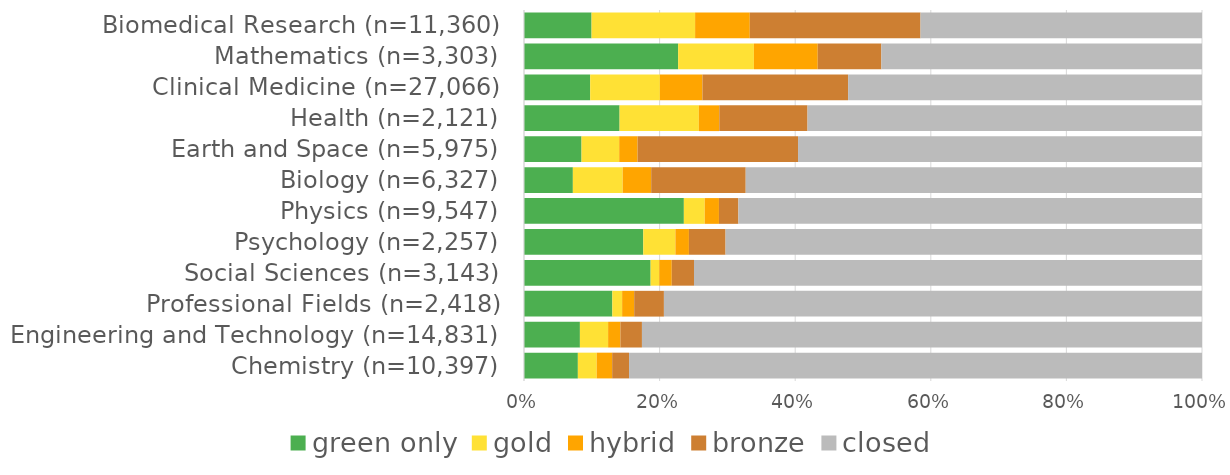
| Category | green only | gold | hybrid | bronze | closed |
|---|---|---|---|---|---|
| Chemistry (n=10,397) | 0.079 | 0.028 | 0.023 | 0.025 | 0.845 |
| Engineering and Technology (n=14,831) | 0.082 | 0.042 | 0.018 | 0.032 | 0.826 |
| Professional Fields (n=2,418) | 0.13 | 0.014 | 0.018 | 0.044 | 0.794 |
| Social Sciences (n=3,143) | 0.187 | 0.013 | 0.018 | 0.033 | 0.749 |
| Psychology (n=2,257) | 0.176 | 0.047 | 0.02 | 0.054 | 0.703 |
| Physics (n=9,547) | 0.236 | 0.031 | 0.021 | 0.029 | 0.684 |
| Biology (n=6,327) | 0.072 | 0.073 | 0.042 | 0.139 | 0.673 |
| Earth and Space (n=5,975) | 0.085 | 0.056 | 0.027 | 0.237 | 0.596 |
| Health (n=2,121) | 0.141 | 0.117 | 0.03 | 0.13 | 0.582 |
| Clinical Medicine (n=27,066) | 0.098 | 0.103 | 0.063 | 0.215 | 0.522 |
| Mathematics (n=3,303) | 0.227 | 0.112 | 0.094 | 0.094 | 0.473 |
| Biomedical Research (n=11,360) | 0.1 | 0.153 | 0.081 | 0.252 | 0.415 |